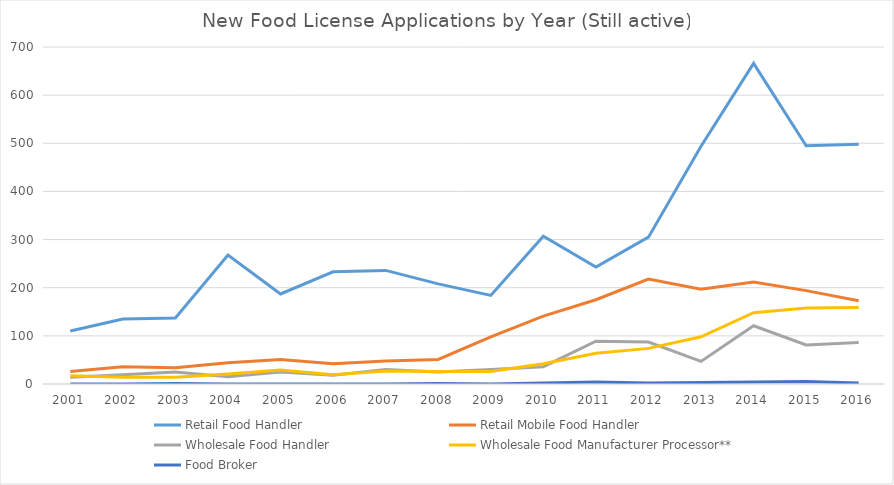
| Category | Retail Food Handler | Retail Mobile Food Handler | Wholesale Food Handler | Wholesale Food Manufacturer Processor** | Food Broker |
|---|---|---|---|---|---|
| 2001.0 | 110 | 26 | 14 | 17 | 0 |
| 2002.0 | 135 | 36 | 19 | 14 | 0 |
| 2003.0 | 137 | 34 | 25 | 14 | 1 |
| 2004.0 | 268 | 44 | 15 | 21 | 0 |
| 2005.0 | 187 | 51 | 25 | 29 | 0 |
| 2006.0 | 233 | 42 | 18 | 19 | 0 |
| 2007.0 | 236 | 48 | 30 | 27 | 0 |
| 2008.0 | 208 | 51 | 25 | 26 | 1 |
| 2009.0 | 184 | 98 | 30 | 26 | 0 |
| 2010.0 | 307 | 141 | 36 | 42 | 2 |
| 2011.0 | 243 | 175 | 89 | 64 | 4 |
| 2012.0 | 305 | 218 | 87 | 74 | 2 |
| 2013.0 | 494 | 197 | 47 | 98 | 3 |
| 2014.0 | 666 | 212 | 121 | 148 | 4 |
| 2015.0 | 495 | 194 | 81 | 158 | 5 |
| 2016.0 | 498 | 173 | 86 | 159 | 2 |